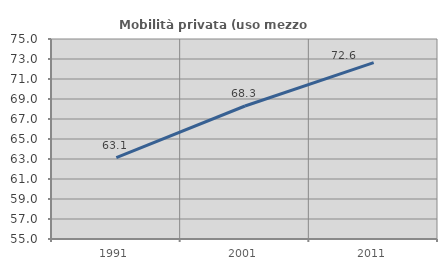
| Category | Mobilità privata (uso mezzo privato) |
|---|---|
| 1991.0 | 63.147 |
| 2001.0 | 68.301 |
| 2011.0 | 72.64 |